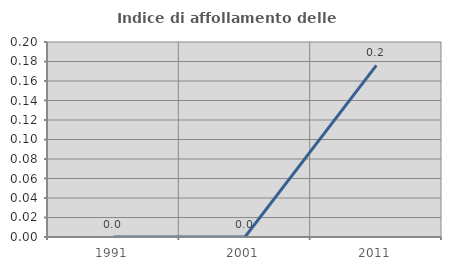
| Category | Indice di affollamento delle abitazioni  |
|---|---|
| 1991.0 | 0 |
| 2001.0 | 0 |
| 2011.0 | 0.176 |